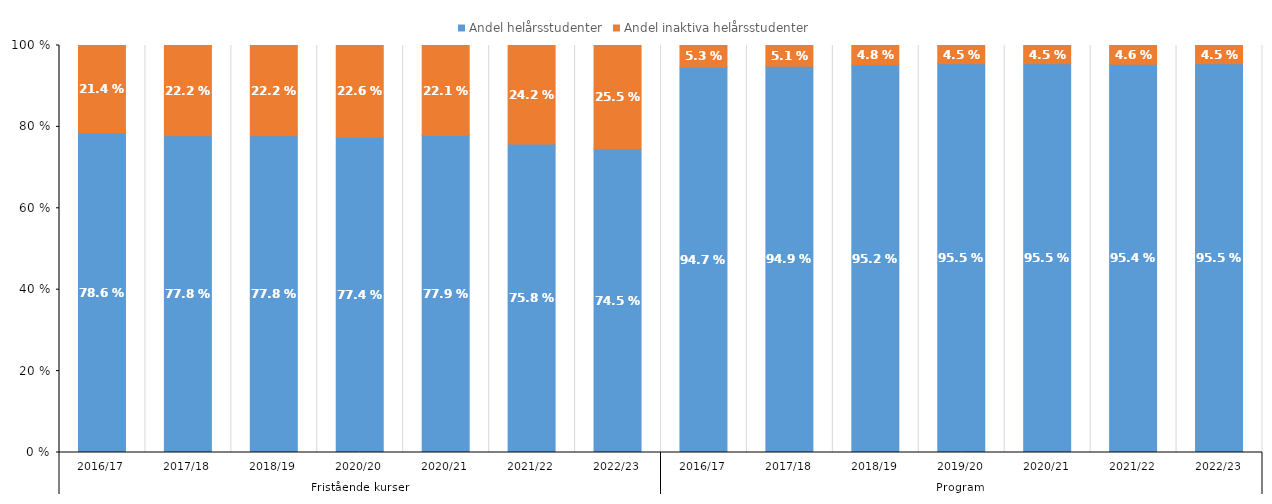
| Category | Andel helårsstudenter | Andel inaktiva helårsstudenter |
|---|---|---|
| 0 | 0.786 | 0.214 |
| 1 | 0.778 | 0.222 |
| 2 | 0.778 | 0.222 |
| 3 | 0.774 | 0.226 |
| 4 | 0.779 | 0.221 |
| 5 | 0.758 | 0.242 |
| 6 | 0.745 | 0.255 |
| 7 | 0.947 | 0.053 |
| 8 | 0.949 | 0.051 |
| 9 | 0.952 | 0.048 |
| 10 | 0.955 | 0.045 |
| 11 | 0.955 | 0.045 |
| 12 | 0.954 | 0.046 |
| 13 | 0.955 | 0.045 |